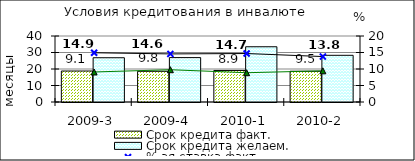
| Category | Срок кредита факт.  | Срок кредита желаем. |
|---|---|---|
| 2009-3 | 18.77 | 26.82 |
| 2009-4 | 18.61 | 26.91 |
| 2010-1 | 19.11 | 33.48 |
| 2010-2 | 18.64 | 28.3 |